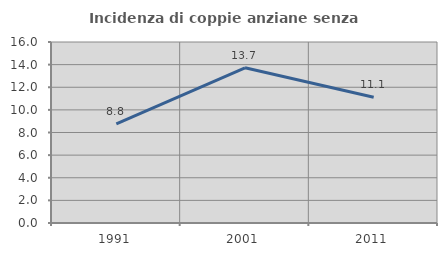
| Category | Incidenza di coppie anziane senza figli  |
|---|---|
| 1991.0 | 8.772 |
| 2001.0 | 13.723 |
| 2011.0 | 11.111 |